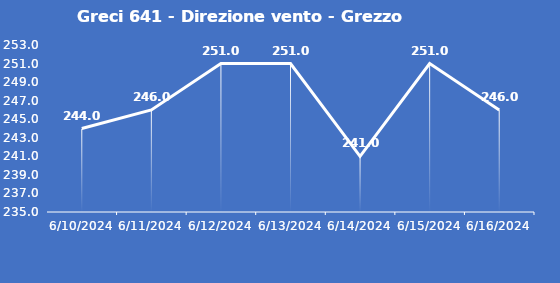
| Category | Greci 641 - Direzione vento - Grezzo (°N) |
|---|---|
| 6/10/24 | 244 |
| 6/11/24 | 246 |
| 6/12/24 | 251 |
| 6/13/24 | 251 |
| 6/14/24 | 241 |
| 6/15/24 | 251 |
| 6/16/24 | 246 |